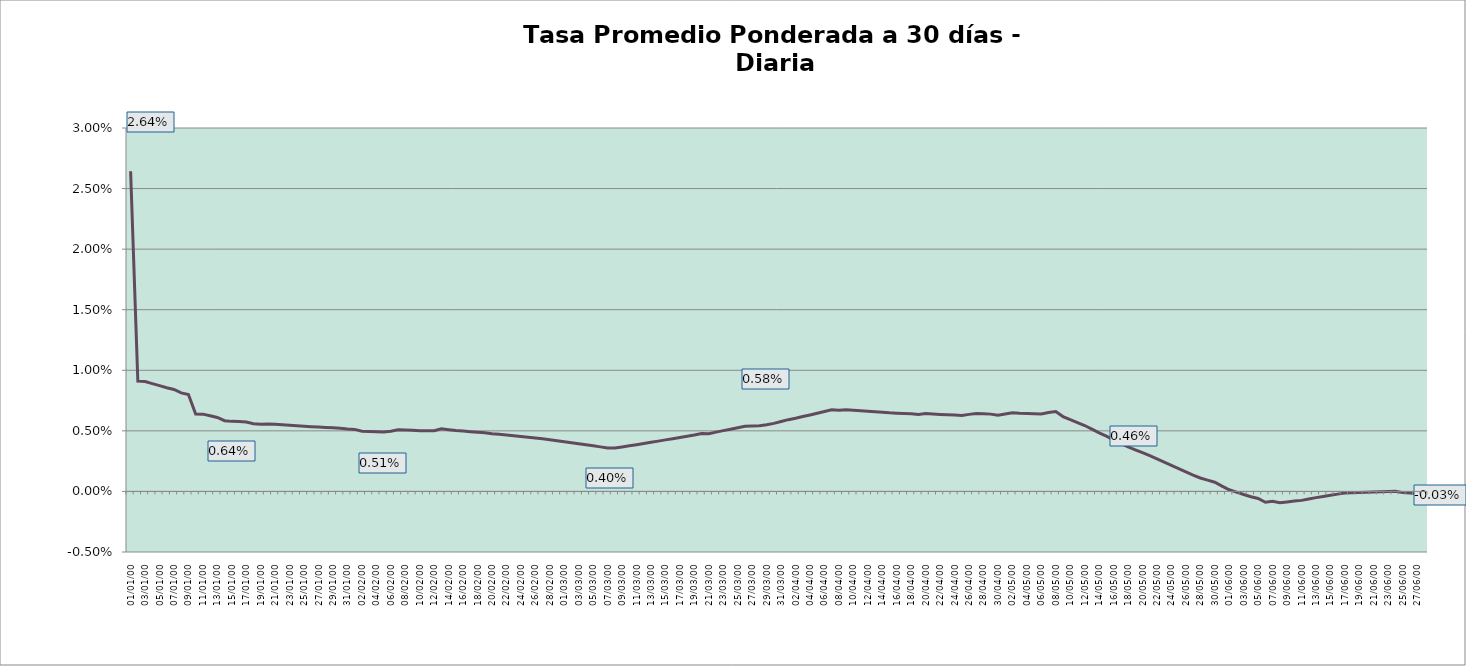
| Category | Tasa a 30 días |
|---|---|
| 0 | 0.026 |
| 1900-01-01 | 0.009 |
| 1900-01-02 | 0.009 |
| 1900-01-03 | 0.009 |
| 1900-01-04 | 0.009 |
| 1900-01-05 | 0.009 |
| 1900-01-06 | 0.008 |
| 1900-01-07 | 0.008 |
| 1900-01-08 | 0.008 |
| 1900-01-09 | 0.006 |
| 1900-01-10 | 0.006 |
| 1900-01-11 | 0.006 |
| 1900-01-12 | 0.006 |
| 1900-01-13 | 0.006 |
| 1900-01-14 | 0.006 |
| 1900-01-15 | 0.006 |
| 1900-01-16 | 0.006 |
| 1900-01-17 | 0.006 |
| 1900-01-18 | 0.006 |
| 1900-01-19 | 0.006 |
| 1900-01-20 | 0.006 |
| 1900-01-21 | 0.006 |
| 1900-01-22 | 0.005 |
| 1900-01-23 | 0.005 |
| 1900-01-24 | 0.005 |
| 1900-01-25 | 0.005 |
| 1900-01-26 | 0.005 |
| 1900-01-27 | 0.005 |
| 1900-01-28 | 0.005 |
| 1900-01-29 | 0.005 |
| 1900-01-30 | 0.005 |
| 1900-01-31 | 0.005 |
| 1900-02-01 | 0.005 |
| 1900-02-02 | 0.005 |
| 1900-02-03 | 0.005 |
| 1900-02-04 | 0.005 |
| 1900-02-05 | 0.005 |
| 1900-02-06 | 0.005 |
| 1900-02-07 | 0.005 |
| 1900-02-08 | 0.005 |
| 1900-02-09 | 0.005 |
| 1900-02-10 | 0.005 |
| 1900-02-11 | 0.005 |
| 1900-02-12 | 0.005 |
| 1900-02-13 | 0.005 |
| 1900-02-14 | 0.005 |
| 1900-02-15 | 0.005 |
| 1900-02-16 | 0.005 |
| 1900-02-17 | 0.005 |
| 1900-02-18 | 0.005 |
| 1900-02-19 | 0.005 |
| 1900-02-20 | 0.005 |
| 1900-02-21 | 0.005 |
| 1900-02-22 | 0.005 |
| 1900-02-23 | 0.005 |
| 1900-02-24 | 0.004 |
| 1900-02-25 | 0.004 |
| 1900-02-26 | 0.004 |
| 1900-02-27 | 0.004 |
| 1900-02-28 | 0.004 |
| 1900-02-28 | 0.004 |
| 1900-03-01 | 0.004 |
| 1900-03-02 | 0.004 |
| 1900-03-03 | 0.004 |
| 1900-03-04 | 0.004 |
| 1900-03-05 | 0.004 |
| 1900-03-06 | 0.004 |
| 1900-03-07 | 0.004 |
| 1900-03-08 | 0.004 |
| 1900-03-09 | 0.004 |
| 1900-03-10 | 0.004 |
| 1900-03-11 | 0.004 |
| 1900-03-12 | 0.004 |
| 1900-03-13 | 0.004 |
| 1900-03-14 | 0.004 |
| 1900-03-15 | 0.004 |
| 1900-03-16 | 0.004 |
| 1900-03-17 | 0.005 |
| 1900-03-18 | 0.005 |
| 1900-03-19 | 0.005 |
| 1900-03-20 | 0.005 |
| 1900-03-21 | 0.005 |
| 1900-03-22 | 0.005 |
| 1900-03-23 | 0.005 |
| 1900-03-24 | 0.005 |
| 1900-03-25 | 0.005 |
| 1900-03-26 | 0.005 |
| 1900-03-27 | 0.005 |
| 1900-03-28 | 0.006 |
| 1900-03-29 | 0.006 |
| 1900-03-30 | 0.006 |
| 1900-03-31 | 0.006 |
| 1900-04-01 | 0.006 |
| 1900-04-02 | 0.006 |
| 1900-04-03 | 0.006 |
| 1900-04-04 | 0.006 |
| 1900-04-05 | 0.007 |
| 1900-04-06 | 0.007 |
| 1900-04-07 | 0.007 |
| 1900-04-08 | 0.007 |
| 1900-04-09 | 0.007 |
| 1900-04-10 | 0.007 |
| 1900-04-11 | 0.007 |
| 1900-04-12 | 0.007 |
| 1900-04-13 | 0.007 |
| 1900-04-14 | 0.006 |
| 1900-04-15 | 0.006 |
| 1900-04-16 | 0.006 |
| 1900-04-17 | 0.006 |
| 1900-04-18 | 0.006 |
| 1900-04-19 | 0.006 |
| 1900-04-20 | 0.006 |
| 1900-04-21 | 0.006 |
| 1900-04-22 | 0.006 |
| 1900-04-23 | 0.006 |
| 1900-04-24 | 0.006 |
| 1900-04-25 | 0.006 |
| 1900-04-26 | 0.006 |
| 1900-04-27 | 0.006 |
| 1900-04-28 | 0.006 |
| 1900-04-29 | 0.006 |
| 1900-04-30 | 0.006 |
| 1900-05-01 | 0.006 |
| 1900-05-02 | 0.006 |
| 1900-05-03 | 0.006 |
| 1900-05-04 | 0.006 |
| 1900-05-05 | 0.006 |
| 1900-05-06 | 0.007 |
| 1900-05-07 | 0.007 |
| 1900-05-08 | 0.006 |
| 1900-05-09 | 0.006 |
| 1900-05-10 | 0.006 |
| 1900-05-11 | 0.005 |
| 1900-05-12 | 0.005 |
| 1900-05-13 | 0.005 |
| 1900-05-14 | 0.005 |
| 1900-05-15 | 0.004 |
| 1900-05-16 | 0.004 |
| 1900-05-17 | 0.004 |
| 1900-05-18 | 0.003 |
| 1900-05-19 | 0.003 |
| 1900-05-20 | 0.003 |
| 1900-05-21 | 0.003 |
| 1900-05-22 | 0.002 |
| 1900-05-23 | 0.002 |
| 1900-05-24 | 0.002 |
| 1900-05-25 | 0.002 |
| 1900-05-26 | 0.001 |
| 1900-05-27 | 0.001 |
| 1900-05-28 | 0.001 |
| 1900-05-29 | 0.001 |
| 1900-05-30 | 0 |
| 1900-05-31 | 0 |
| 1900-06-01 | 0 |
| 1900-06-02 | 0 |
| 1900-06-03 | 0 |
| 1900-06-04 | -0.001 |
| 1900-06-05 | -0.001 |
| 1900-06-06 | -0.001 |
| 1900-06-07 | -0.001 |
| 1900-06-08 | -0.001 |
| 1900-06-09 | -0.001 |
| 1900-06-10 | -0.001 |
| 1900-06-11 | -0.001 |
| 1900-06-12 | -0.001 |
| 1900-06-13 | 0 |
| 1900-06-14 | 0 |
| 1900-06-15 | 0 |
| 1900-06-16 | 0 |
| 1900-06-17 | 0 |
| 1900-06-18 | 0 |
| 1900-06-19 | 0 |
| 1900-06-20 | 0 |
| 1900-06-21 | 0 |
| 1900-06-22 | 0 |
| 1900-06-23 | 0 |
| 1900-06-24 | 0 |
| 1900-06-25 | 0 |
| 1900-06-26 | 0 |
| 1900-06-27 | 0 |